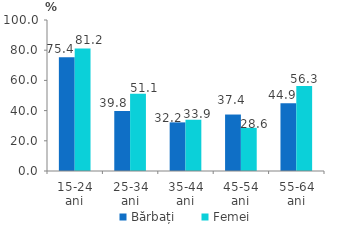
| Category | Bărbați | Femei |
|---|---|---|
| 15-24 ani | 75.4 | 81.2 |
| 25-34 ani | 39.8 | 51.1 |
| 35-44 ani | 32.2 | 33.9 |
| 45-54 ani | 37.4 | 28.6 |
| 55-64 ani | 44.9 | 56.3 |